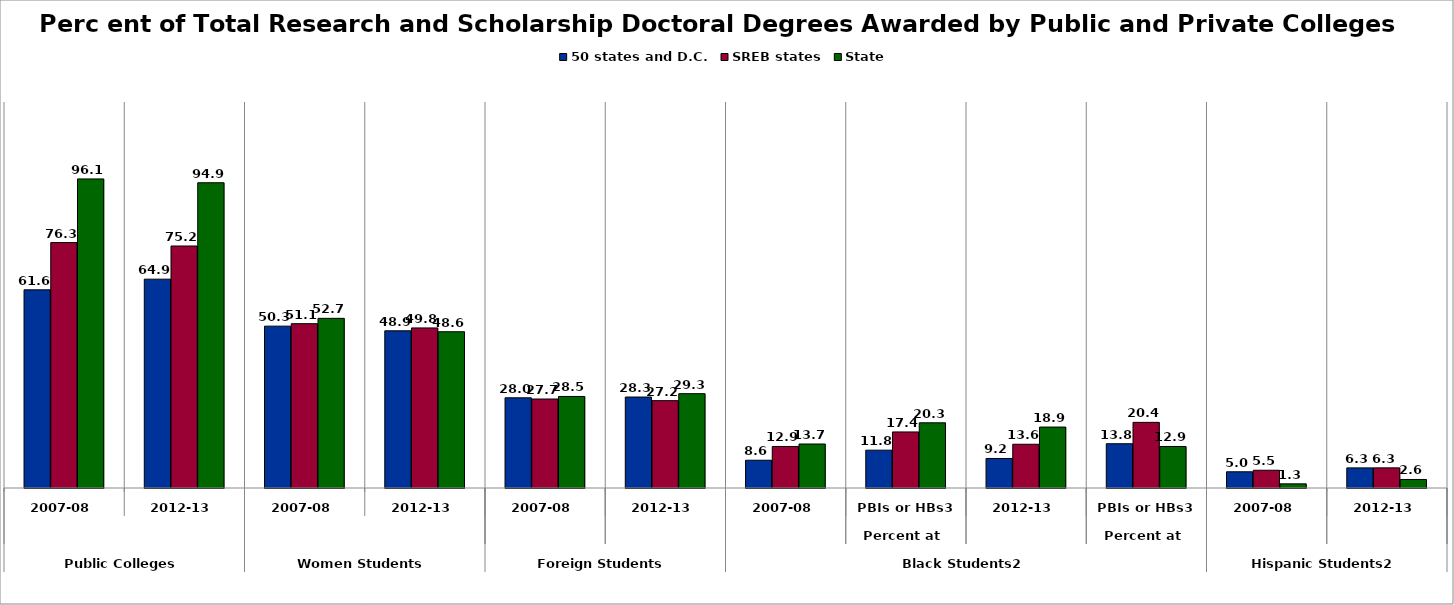
| Category | 50 states and D.C. | SREB states | State |
|---|---|---|---|
| 0 | 61.609 | 76.307 | 96.084 |
| 1 | 64.921 | 75.229 | 94.901 |
| 2 | 50.316 | 51.082 | 52.742 |
| 3 | 48.869 | 49.762 | 48.584 |
| 4 | 28.042 | 27.668 | 28.46 |
| 5 | 28.277 | 27.156 | 29.32 |
| 6 | 8.63 | 12.907 | 13.678 |
| 7 | 11.76 | 17.426 | 20.27 |
| 8 | 9.177 | 13.597 | 18.941 |
| 9 | 13.763 | 20.403 | 12.903 |
| 10 | 5.042 | 5.517 | 1.294 |
| 11 | 6.252 | 6.265 | 2.648 |